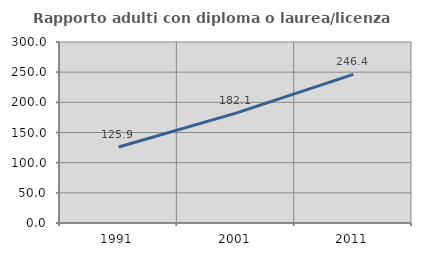
| Category | Rapporto adulti con diploma o laurea/licenza media  |
|---|---|
| 1991.0 | 125.902 |
| 2001.0 | 182.093 |
| 2011.0 | 246.358 |